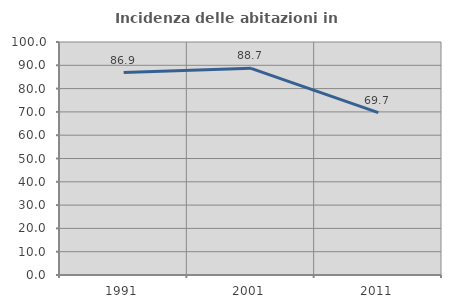
| Category | Incidenza delle abitazioni in proprietà  |
|---|---|
| 1991.0 | 86.885 |
| 2001.0 | 88.699 |
| 2011.0 | 69.684 |